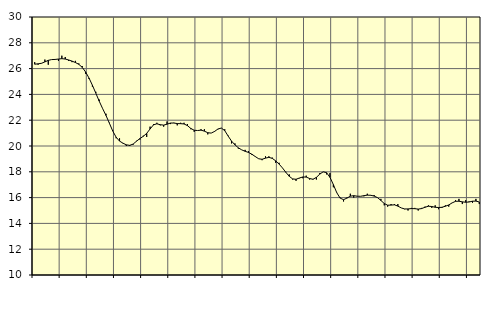
| Category | Piggar | Tillverkning o utvinning, energi o miljö, SNI 05-33, 35-39 |
|---|---|---|
| nan | 26.5 | 26.34 |
| 87.0 | 26.3 | 26.37 |
| 87.0 | 26.4 | 26.41 |
| 87.0 | 26.7 | 26.52 |
| nan | 26.3 | 26.64 |
| 88.0 | 26.7 | 26.7 |
| 88.0 | 26.7 | 26.71 |
| 88.0 | 26.6 | 26.74 |
| nan | 27 | 26.77 |
| 89.0 | 26.9 | 26.74 |
| 89.0 | 26.6 | 26.67 |
| 89.0 | 26.5 | 26.58 |
| nan | 26.6 | 26.47 |
| 90.0 | 26.4 | 26.33 |
| 90.0 | 26.2 | 26.1 |
| 90.0 | 25.6 | 25.74 |
| nan | 25.2 | 25.27 |
| 91.0 | 24.6 | 24.71 |
| 91.0 | 24.2 | 24.1 |
| 91.0 | 23.6 | 23.48 |
| nan | 22.9 | 22.91 |
| 92.0 | 22.5 | 22.37 |
| 92.0 | 21.8 | 21.77 |
| 92.0 | 21.2 | 21.16 |
| nan | 20.6 | 20.68 |
| 93.0 | 20.6 | 20.38 |
| 93.0 | 20.2 | 20.22 |
| 93.0 | 20 | 20.09 |
| nan | 20 | 20.05 |
| 94.0 | 20.1 | 20.15 |
| 94.0 | 20.4 | 20.37 |
| 94.0 | 20.5 | 20.58 |
| nan | 20.8 | 20.75 |
| 95.0 | 20.7 | 20.98 |
| 95.0 | 21.5 | 21.32 |
| 95.0 | 21.7 | 21.64 |
| nan | 21.8 | 21.72 |
| 96.0 | 21.6 | 21.65 |
| 96.0 | 21.5 | 21.62 |
| 96.0 | 21.9 | 21.69 |
| nan | 21.7 | 21.78 |
| 97.0 | 21.8 | 21.78 |
| 97.0 | 21.6 | 21.74 |
| 97.0 | 21.8 | 21.73 |
| nan | 21.8 | 21.71 |
| 98.0 | 21.7 | 21.58 |
| 98.0 | 21.3 | 21.36 |
| 98.0 | 21.1 | 21.22 |
| nan | 21.2 | 21.2 |
| 99.0 | 21.3 | 21.23 |
| 99.0 | 21.3 | 21.15 |
| 99.0 | 20.9 | 21.03 |
| nan | 21 | 21 |
| 0.0 | 21.1 | 21.13 |
| 0.0 | 21.3 | 21.32 |
| 0.0 | 21.4 | 21.39 |
| nan | 21.3 | 21.19 |
| 1.0 | 20.8 | 20.77 |
| 1.0 | 20.2 | 20.38 |
| 1.0 | 20.2 | 20.09 |
| nan | 19.8 | 19.86 |
| 2.0 | 19.7 | 19.7 |
| 2.0 | 19.7 | 19.59 |
| 2.0 | 19.6 | 19.5 |
| nan | 19.3 | 19.36 |
| 3.0 | 19.2 | 19.18 |
| 3.0 | 19 | 19.01 |
| 3.0 | 18.9 | 18.97 |
| nan | 19.2 | 19.06 |
| 4.0 | 19.2 | 19.12 |
| 4.0 | 19.1 | 19.04 |
| 4.0 | 18.7 | 18.85 |
| nan | 18.7 | 18.6 |
| 5.0 | 18.3 | 18.3 |
| 5.0 | 18 | 17.96 |
| 5.0 | 17.8 | 17.65 |
| nan | 17.4 | 17.45 |
| 6.0 | 17.3 | 17.42 |
| 6.0 | 17.5 | 17.52 |
| 6.0 | 17.5 | 17.6 |
| nan | 17.7 | 17.59 |
| 7.0 | 17.4 | 17.48 |
| 7.0 | 17.4 | 17.42 |
| 7.0 | 17.4 | 17.57 |
| nan | 17.9 | 17.82 |
| 8.0 | 18 | 18 |
| 8.0 | 17.8 | 17.93 |
| 8.0 | 17.9 | 17.57 |
| nan | 16.8 | 17.01 |
| 9.0 | 16.4 | 16.38 |
| 9.0 | 16 | 15.96 |
| 9.0 | 15.7 | 15.84 |
| nan | 16 | 15.96 |
| 10.0 | 16.3 | 16.11 |
| 10.0 | 16 | 16.15 |
| 10.0 | 16.1 | 16.11 |
| nan | 16.1 | 16.1 |
| 11.0 | 16.1 | 16.15 |
| 11.0 | 16.3 | 16.19 |
| 11.0 | 16.2 | 16.18 |
| nan | 16.2 | 16.12 |
| 12.0 | 16 | 16 |
| 12.0 | 15.9 | 15.78 |
| 12.0 | 15.4 | 15.54 |
| nan | 15.3 | 15.41 |
| 13.0 | 15.5 | 15.42 |
| 13.0 | 15.5 | 15.44 |
| 13.0 | 15.5 | 15.34 |
| nan | 15.2 | 15.2 |
| 14.0 | 15.1 | 15.12 |
| 14.0 | 15 | 15.12 |
| 14.0 | 15.2 | 15.15 |
| nan | 15.2 | 15.14 |
| 15.0 | 15 | 15.11 |
| 15.0 | 15.2 | 15.15 |
| 15.0 | 15.3 | 15.25 |
| nan | 15.4 | 15.33 |
| 16.0 | 15.2 | 15.31 |
| 16.0 | 15.4 | 15.25 |
| 16.0 | 15.1 | 15.23 |
| nan | 15.2 | 15.25 |
| 17.0 | 15.4 | 15.33 |
| 17.0 | 15.3 | 15.43 |
| 17.0 | 15.6 | 15.59 |
| nan | 15.8 | 15.71 |
| 18.0 | 15.9 | 15.72 |
| 18.0 | 15.5 | 15.67 |
| 18.0 | 15.8 | 15.64 |
| nan | 15.7 | 15.66 |
| 19.0 | 15.6 | 15.72 |
| 19.0 | 15.9 | 15.73 |
| 19.0 | 15.5 | 15.66 |